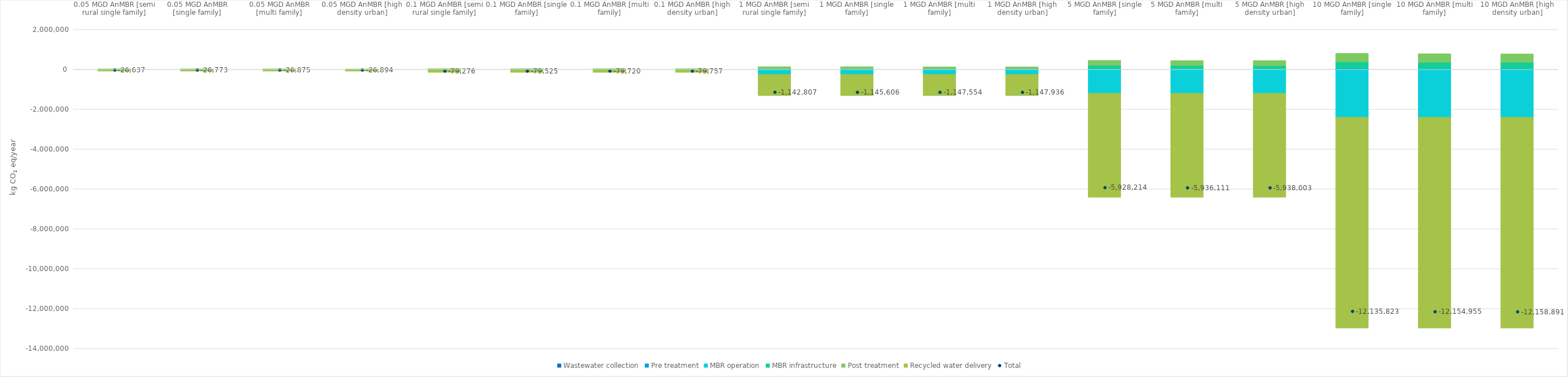
| Category | Wastewater collection | Pre treatment | MBR operation | MBR infrastructure | Post treatment | Recycled water delivery |
|---|---|---|---|---|---|---|
| 0.05 MGD AnMBR [semi rural single family] | 273.813 | 2803.327 | -13442.959 | 3293 | 33166 | -52730.5 |
| 0.05 MGD AnMBR [single family] | 138.47 | 2803.327 | -13442.959 | 3293 | 33166 | -52730.5 |
| 0.05 MGD AnMBR [multi family] | 36.508 | 2803.327 | -13442.959 | 3293 | 33166 | -52730.5 |
| 0.05 MGD AnMBR [high density urban] | 17.267 | 2803.327 | -13442.959 | 3293 | 33166 | -52730.5 |
| 0.1 MGD AnMBR [semi rural single family] | 516.801 | 3903.609 | -22969.476 | 3475 | 39466 | -103668 |
| 0.1 MGD AnMBR [single family] | 267.728 | 3903.609 | -22969.476 | 3475 | 39466 | -103668 |
| 0.1 MGD AnMBR [multi family] | 73.017 | 3903.609 | -22969.476 | 3475 | 39466 | -103668 |
| 0.1 MGD AnMBR [high density urban] | 35.909 | 3903.609 | -22969.476 | 3475 | 39466 | -103668 |
| 1 MGD AnMBR [semi rural single family] | 5476.25 | 12355.95 | -234902.075 | 42772.4 | 90494 | -1059004 |
| 1 MGD AnMBR [single family] | 2677.27 | 12355.95 | -234902.075 | 42772.4 | 90494 | -1059004 |
| 1 MGD AnMBR [multi family] | 730.166 | 12355.95 | -234902.075 | 42772.4 | 90494 | -1059004 |
| 1 MGD AnMBR [high density urban] | 347.92 | 12355.95 | -234902.075 | 42772.4 | 90494 | -1059004 |
| 5 MGD AnMBR [single family] | 11547.6 | 30123.72 | -1186865.1 | 178294 | 245966 | -5207280 |
| 5 MGD AnMBR [multi family] | 3650.83 | 30123.72 | -1186865.1 | 178294 | 245966 | -5207280 |
| 5 MGD AnMBR [high density urban] | 1758.78 | 30123.72 | -1186865.1 | 178294 | 245966 | -5207280 |
| 10 MGD AnMBR [single family] | 26770 | 45957 | -2386084.7 | 320777.78 | 424896 | -10568139.3 |
| 10 MGD AnMBR [multi family] | 7638.32 | 45957 | -2386084.7 | 320777.78 | 424896 | -10568139.3 |
| 10 MGD AnMBR [high density urban] | 3701.92 | 45957 | -2386084.7 | 320777.78 | 424896 | -10568139.3 |